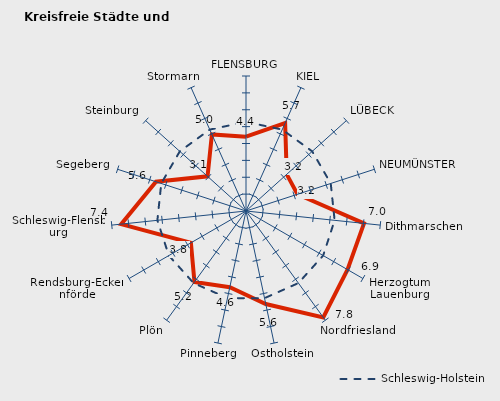
| Category | Kreise | Schleswig-Holstein |
|---|---|---|
| FLENSBURG | 4.403 | 5.281 |
| KIEL | 5.702 | 5.281 |
| LÜBECK | 3.248 | 5.281 |
| NEUMÜNSTER | 3.204 | 5.281 |
| Dithmarschen | 7.032 | 5.281 |
| Herzogtum Lauenburg | 6.944 | 5.281 |
| Nordfriesland | 7.79 | 5.281 |
| Ostholstein | 5.633 | 5.281 |
| Pinneberg | 4.614 | 5.281 |
| Plön | 5.195 | 5.281 |
| Rendsburg-Eckernförde | 3.77 | 5.281 |
| Schleswig-Flensburg | 7.437 | 5.281 |
| Segeberg | 5.608 | 5.281 |
| Steinburg | 3.068 | 5.281 |
| Stormarn | 4.968 | 5.281 |